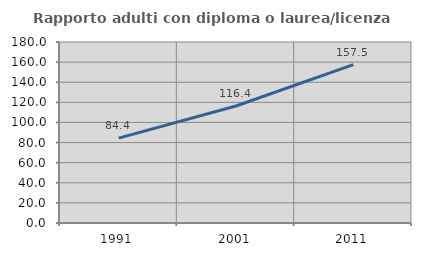
| Category | Rapporto adulti con diploma o laurea/licenza media  |
|---|---|
| 1991.0 | 84.448 |
| 2001.0 | 116.37 |
| 2011.0 | 157.533 |